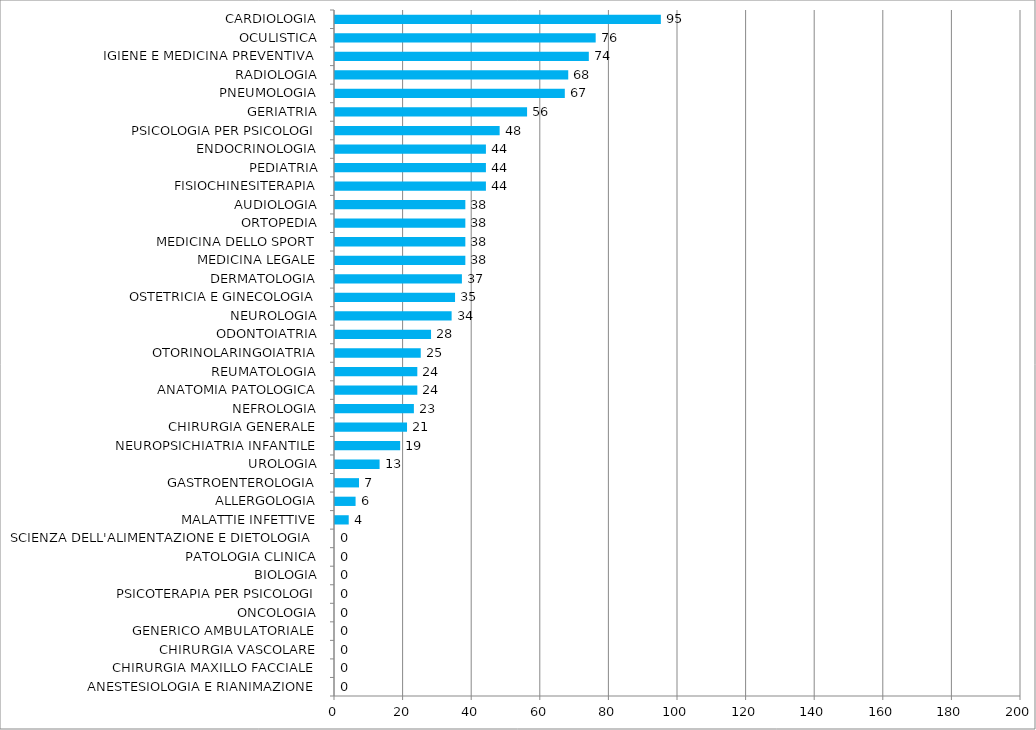
| Category | Series 0 |
|---|---|
| ANESTESIOLOGIA E RIANIMAZIONE | 0 |
| CHIRURGIA MAXILLO FACCIALE | 0 |
| CHIRURGIA VASCOLARE | 0 |
| GENERICO AMBULATORIALE | 0 |
| ONCOLOGIA | 0 |
| PSICOTERAPIA PER PSICOLOGI | 0 |
| BIOLOGIA | 0 |
| PATOLOGIA CLINICA | 0 |
| SCIENZA DELL'ALIMENTAZIONE E DIETOLOGIA | 0 |
| MALATTIE INFETTIVE | 4 |
| ALLERGOLOGIA | 6 |
| GASTROENTEROLOGIA | 7 |
| UROLOGIA | 13 |
| NEUROPSICHIATRIA INFANTILE | 19 |
| CHIRURGIA GENERALE | 21 |
| NEFROLOGIA | 23 |
| ANATOMIA PATOLOGICA | 24 |
| REUMATOLOGIA | 24 |
| OTORINOLARINGOIATRIA | 25 |
| ODONTOIATRIA | 28 |
| NEUROLOGIA | 34 |
| OSTETRICIA E GINECOLOGIA | 35 |
| DERMATOLOGIA | 37 |
| MEDICINA LEGALE | 38 |
| MEDICINA DELLO SPORT | 38 |
| ORTOPEDIA | 38 |
| AUDIOLOGIA | 38 |
| FISIOCHINESITERAPIA | 44 |
| PEDIATRIA | 44 |
| ENDOCRINOLOGIA | 44 |
| PSICOLOGIA PER PSICOLOGI | 48 |
| GERIATRIA | 56 |
| PNEUMOLOGIA | 67 |
| RADIOLOGIA | 68 |
| IGIENE E MEDICINA PREVENTIVA | 74 |
| OCULISTICA | 76 |
| CARDIOLOGIA | 95 |